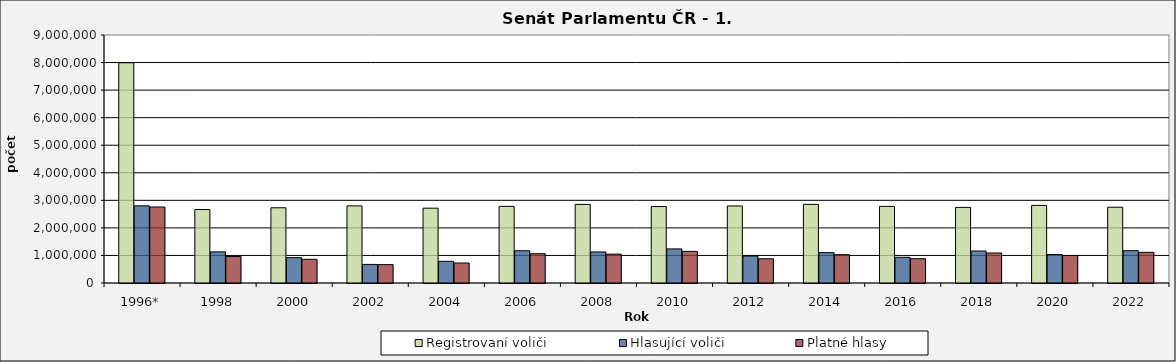
| Category | Registrovaní voliči | Hlasující voliči | Platné hlasy |
|---|---|---|---|
| 1996* | 7992740 | 2800108 | 2758125 |
| 1998 | 2666398 | 1129648 | 962111 |
| 2000 | 2730142 | 920704 | 860442 |
| 2002 | 2797846 | 674333 | 666455 |
| 2004 | 2715437 | 786732 | 724686 |
| 2006 | 2780914 | 1170474 | 1063614 |
| 2008 | 2852506 | 1127259 | 1047358 |
| 2010 | 2774178 | 1237072 | 1147390 |
| 2012 | 2795405 | 975511 | 879222 |
| 2014 | 2853106 | 1101753 | 1026615 |
| 2016 | 2780706 | 932616 | 881170 |
| 2018 | 2743745 | 1159603 | 1089689 |
| 2020 | 2815827 | 1034469 | 997261 |
| 2022 | 2749658 | 1172795 | 1112519 |